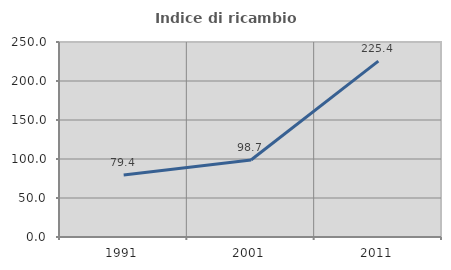
| Category | Indice di ricambio occupazionale  |
|---|---|
| 1991.0 | 79.405 |
| 2001.0 | 98.678 |
| 2011.0 | 225.45 |